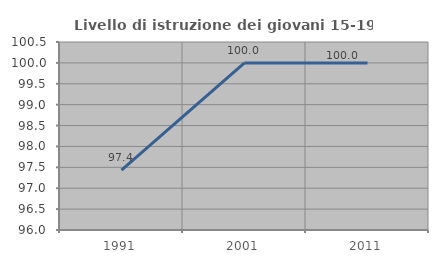
| Category | Livello di istruzione dei giovani 15-19 anni |
|---|---|
| 1991.0 | 97.436 |
| 2001.0 | 100 |
| 2011.0 | 100 |